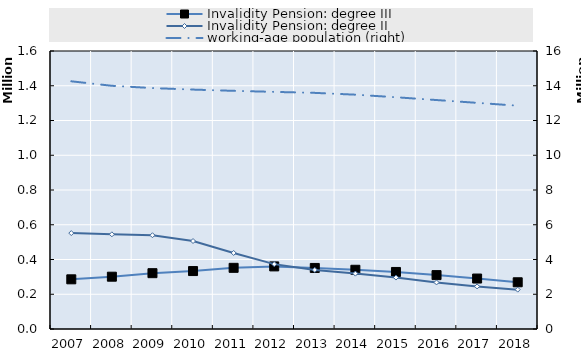
| Category | Invalidity Pension: degree III | Invalidity Pension: degree II |
|---|---|---|
| 2007.0 | 285899.5 | 551947 |
| 2008.0 | 300999 | 544922.75 |
| 2009.0 | 321308 | 539695 |
| 2010.0 | 333466.75 | 506283.833 |
| 2011.0 | 352067 | 437665.167 |
| 2012.0 | 360264 | 373406.833 |
| 2013.0 | 351356 | 339814 |
| 2014.0 | 340850 | 318769 |
| 2015.0 | 328310 | 296073 |
| 2016.0 | 310116 | 267971 |
| 2017.0 | 290439 | 244810 |
| 2018.0 | 268922 | 226586 |